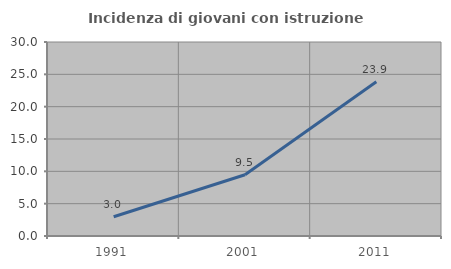
| Category | Incidenza di giovani con istruzione universitaria |
|---|---|
| 1991.0 | 2.976 |
| 2001.0 | 9.479 |
| 2011.0 | 23.853 |